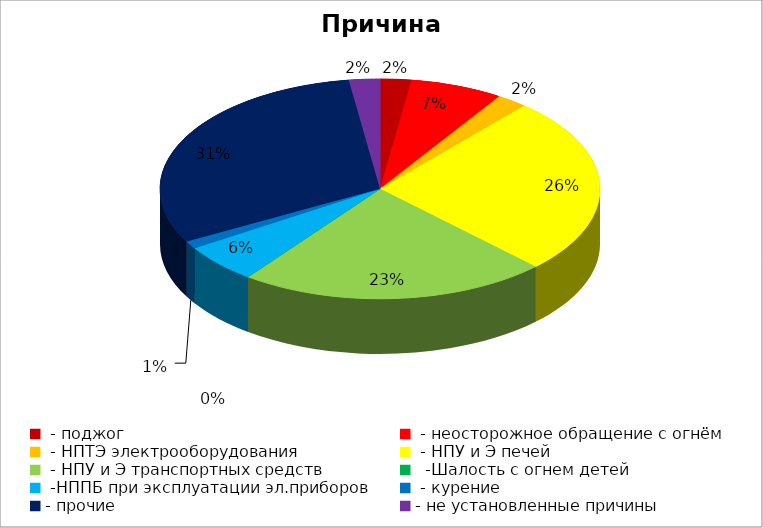
| Category | Причина пожара |
|---|---|
|  - поджог | 2 |
|  - неосторожное обращение с огнём | 6 |
|  - НПТЭ электрооборудования | 2 |
|  - НПУ и Э печей | 23 |
|  - НПУ и Э транспортных средств | 20 |
|   -Шалость с огнем детей | 0 |
|  -НППБ при эксплуатации эл.приборов | 5 |
|  - курение | 1 |
| - прочие | 27 |
| - не установленные причины | 2 |